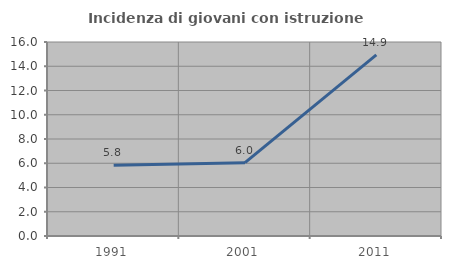
| Category | Incidenza di giovani con istruzione universitaria |
|---|---|
| 1991.0 | 5.83 |
| 2001.0 | 6.05 |
| 2011.0 | 14.943 |